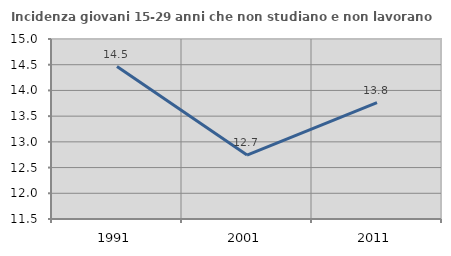
| Category | Incidenza giovani 15-29 anni che non studiano e non lavorano  |
|---|---|
| 1991.0 | 14.464 |
| 2001.0 | 12.744 |
| 2011.0 | 13.764 |